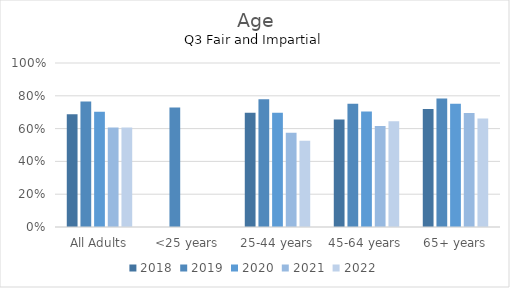
| Category | 2018 | 2019 | 2020 | 2021 | 2022 |
|---|---|---|---|---|---|
| All Adults | 0.687 | 0.766 | 0.703 | 0.607 | 0.606 |
| <25 years | 0 | 0.729 | 0 | 0 | 0 |
| 25-44 years | 0.696 | 0.779 | 0.697 | 0.575 | 0.526 |
| 45-64 years | 0.655 | 0.752 | 0.705 | 0.616 | 0.645 |
| 65+ years | 0.719 | 0.784 | 0.751 | 0.696 | 0.661 |